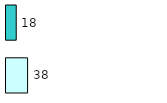
| Category | Series 0 | Series 1 |
|---|---|---|
| 0 | 38 | 18 |